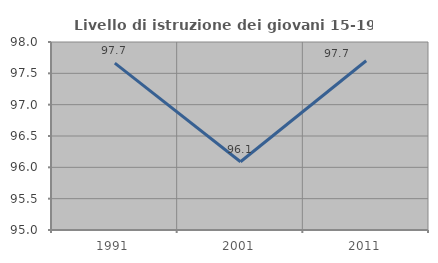
| Category | Livello di istruzione dei giovani 15-19 anni |
|---|---|
| 1991.0 | 97.664 |
| 2001.0 | 96.089 |
| 2011.0 | 97.701 |